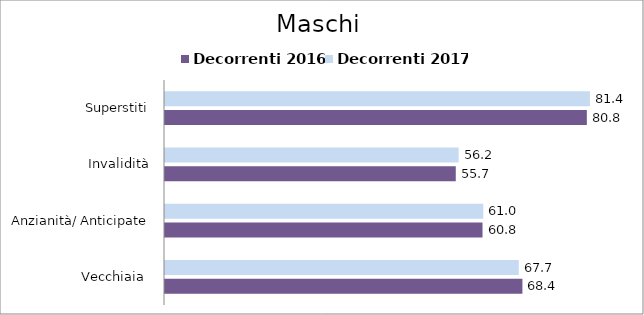
| Category | Decorrenti 2016 | Decorrenti 2017 |
|---|---|---|
| Vecchiaia  | 68.44 | 67.74 |
| Anzianità/ Anticipate | 60.8 | 60.95 |
| Invalidità | 55.68 | 56.23 |
| Superstiti | 80.78 | 81.37 |